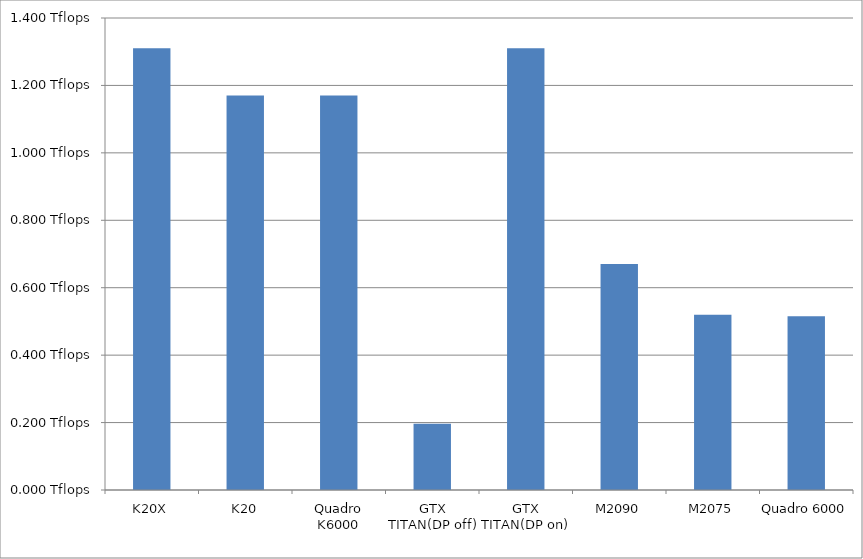
| Category | Series 0 |
|---|---|
| K20X | 1.31 |
| K20 | 1.17 |
| Quadro K6000 | 1.17 |
| GTX TITAN(DP off) | 0.196 |
| GTX TITAN(DP on) | 1.31 |
| M2090 | 0.67 |
| M2075 | 0.52 |
| Quadro 6000 | 0.515 |